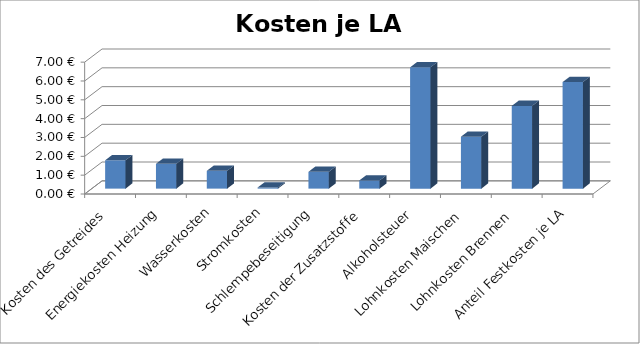
| Category | Kosten je LA Rohbrand |
|---|---|
| Kosten des Getreides | 1.505 |
| Energiekosten Heizung | 1.318 |
| Wasserkosten | 0.945 |
| Stromkosten | 0.06 |
| Schlempebeseitigung | 0.895 |
| Kosten der Zusatzstoffe | 0.435 |
| Alkoholsteuer | 6.442 |
| Lohnkosten Maischen | 2.758 |
| Lohnkosten Brennen | 4.393 |
| Anteil Festkosten je LA | 5.657 |